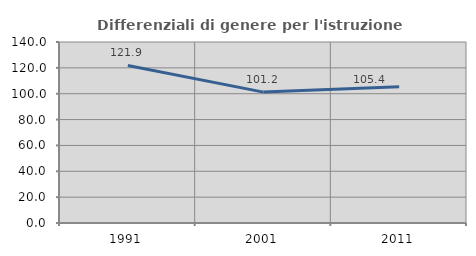
| Category | Differenziali di genere per l'istruzione superiore |
|---|---|
| 1991.0 | 121.889 |
| 2001.0 | 101.233 |
| 2011.0 | 105.407 |